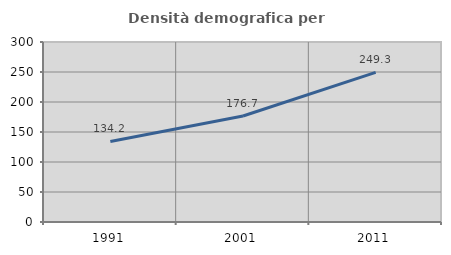
| Category | Densità demografica |
|---|---|
| 1991.0 | 134.205 |
| 2001.0 | 176.679 |
| 2011.0 | 249.293 |